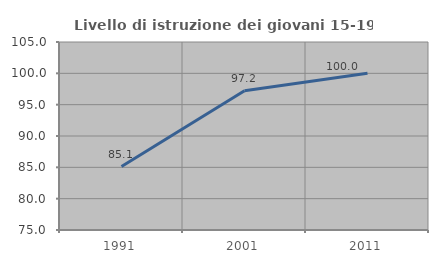
| Category | Livello di istruzione dei giovani 15-19 anni |
|---|---|
| 1991.0 | 85.124 |
| 2001.0 | 97.222 |
| 2011.0 | 100 |